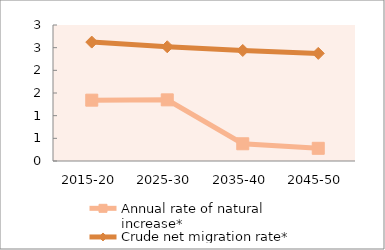
| Category | Annual rate of natural increase* | Crude net migration rate* |
|---|---|---|
| 2015-20 | 1.342 | 2.623 |
| 2025-30 | 1.349 | 2.52 |
| 2035-40 | 0.38 | 2.438 |
| 2045-50 | 0.28 | 2.374 |